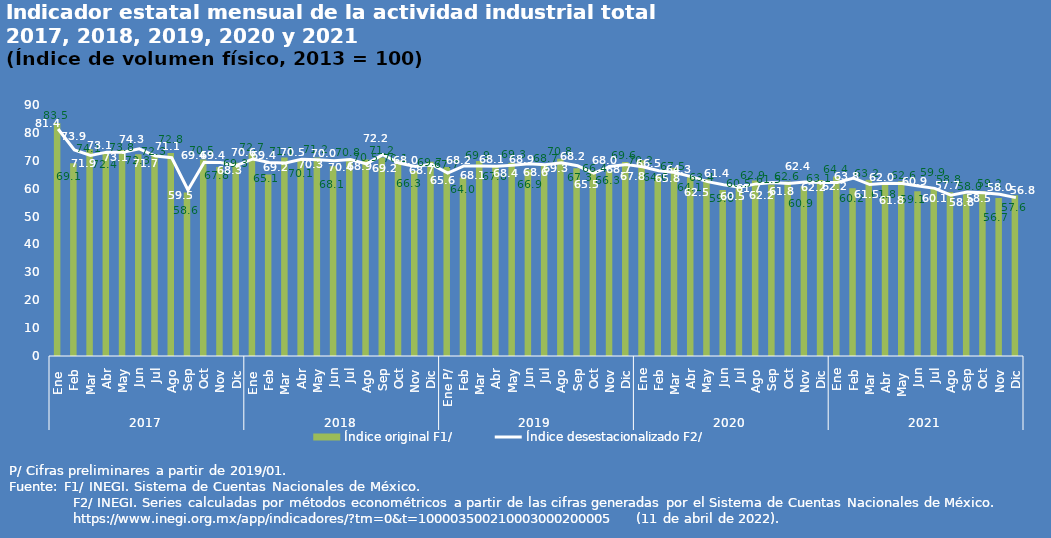
| Category | Índice original F1/ |
|---|---|
| 0 | 83.511 |
| 1 | 69.123 |
| 2 | 74.092 |
| 3 | 72.436 |
| 4 | 73.839 |
| 5 | 72.345 |
| 6 | 72.271 |
| 7 | 72.777 |
| 8 | 58.605 |
| 9 | 70.473 |
| 10 | 67.814 |
| 11 | 69.297 |
| 12 | 72.678 |
| 13 | 65.053 |
| 14 | 71.131 |
| 15 | 70.063 |
| 16 | 71.172 |
| 17 | 68.06 |
| 18 | 70.821 |
| 19 | 70.46 |
| 20 | 71.185 |
| 21 | 70.104 |
| 22 | 66.317 |
| 23 | 69.653 |
| 24 | 67.728 |
| 25 | 64.032 |
| 26 | 69.916 |
| 27 | 67.799 |
| 28 | 69.325 |
| 29 | 66.911 |
| 30 | 68.689 |
| 31 | 70.771 |
| 32 | 67.342 |
| 33 | 66.385 |
| 34 | 66.281 |
| 35 | 69.6 |
| 36 | 70.159 |
| 37 | 64.635 |
| 38 | 67.535 |
| 39 | 64.123 |
| 40 | 63.355 |
| 41 | 59.559 |
| 42 | 60.465 |
| 43 | 62.928 |
| 44 | 61.452 |
| 45 | 62.562 |
| 46 | 60.896 |
| 47 | 63.117 |
| 48 | 64.399 |
| 49 | 60.192 |
| 50 | 63.174 |
| 51 | 61.798 |
| 52 | 62.62 |
| 53 | 59.077 |
| 54 | 59.905 |
| 55 | 58.753 |
| 56 | 58.004 |
| 57 | 59.208 |
| 58 | 56.688 |
| 59 | 57.612 |